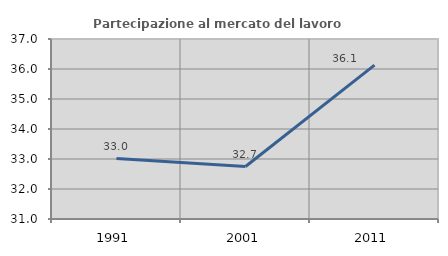
| Category | Partecipazione al mercato del lavoro  femminile |
|---|---|
| 1991.0 | 33.014 |
| 2001.0 | 32.749 |
| 2011.0 | 36.129 |